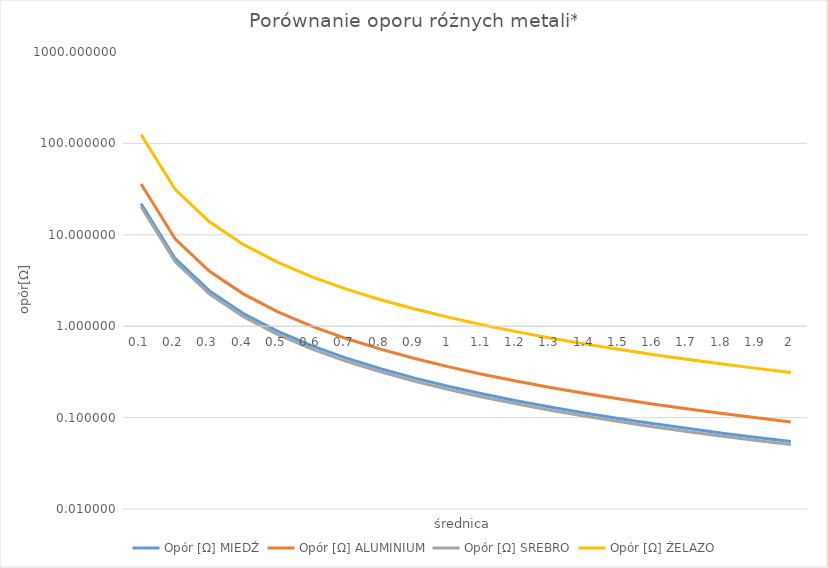
| Category | Opór [Ω] MIEDŹ | Opór [Ω] ALUMINIUM | Opór [Ω] SREBRO | Opór [Ω] ŻELAZO |
|---|---|---|---|---|
| 0.1 | 21.9 | 35.905 | 20.245 | 124.777 |
| 0.2 | 5.475 | 8.976 | 5.061 | 31.194 |
| 0.3 | 2.433 | 3.989 | 2.249 | 13.864 |
| 0.4 | 1.369 | 2.244 | 1.265 | 7.799 |
| 0.5 | 0.876 | 1.436 | 0.81 | 4.991 |
| 0.6 | 0.608 | 0.997 | 0.562 | 3.466 |
| 0.7 | 0.447 | 0.733 | 0.413 | 2.546 |
| 0.8 | 0.342 | 0.561 | 0.316 | 1.95 |
| 0.9 | 0.27 | 0.443 | 0.25 | 1.54 |
| 1.0 | 0.219 | 0.359 | 0.202 | 1.248 |
| 1.1 | 0.181 | 0.297 | 0.167 | 1.031 |
| 1.2 | 0.152 | 0.249 | 0.141 | 0.867 |
| 1.3 | 0.13 | 0.212 | 0.12 | 0.738 |
| 1.4 | 0.112 | 0.183 | 0.103 | 0.637 |
| 1.5 | 0.097 | 0.16 | 0.09 | 0.555 |
| 1.6 | 0.086 | 0.14 | 0.079 | 0.487 |
| 1.7 | 0.076 | 0.124 | 0.07 | 0.432 |
| 1.8 | 0.068 | 0.111 | 0.062 | 0.385 |
| 1.9 | 0.061 | 0.099 | 0.056 | 0.346 |
| 2.0 | 0.055 | 0.09 | 0.051 | 0.312 |